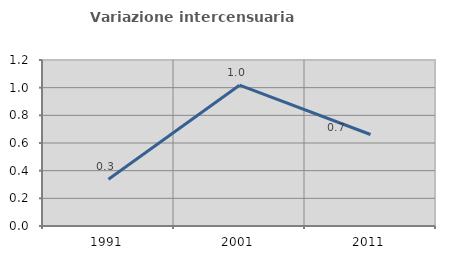
| Category | Variazione intercensuaria annua |
|---|---|
| 1991.0 | 0.339 |
| 2001.0 | 1.018 |
| 2011.0 | 0.661 |